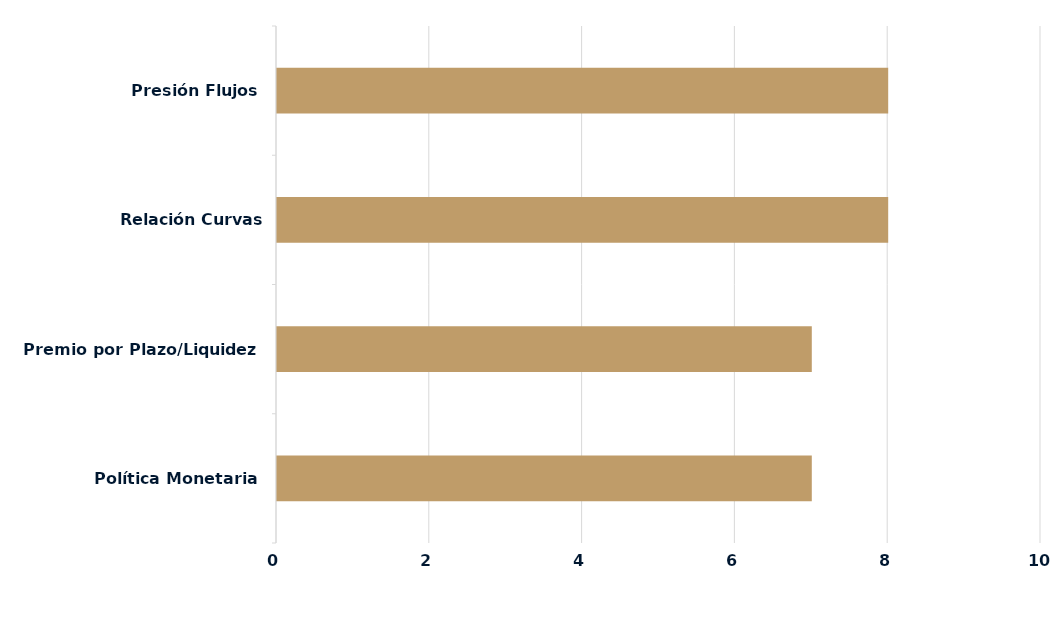
| Category | Series 0 |
|---|---|
| Política Monetaria | 7 |
| Premio por Plazo/Liquidez | 7 |
| Relación Curvas Internacionales | 8 |
| Presión Flujos | 8 |